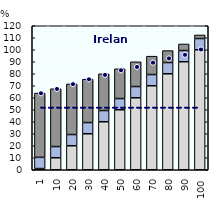
| Category | Gross earnings | Social assistance | Housing benefits | Family benefits | In-work benefits |
|---|---|---|---|---|---|
| 1.0 | 1.001 | 0 | 0 | 9.344 | 53.568 |
| 10.0 | 9.999 | 0 | 0 | 9.344 | 48.169 |
| 20.0 | 20.001 | 0 | 0 | 9.344 | 42.17 |
| 30.0 | 29.999 | 0 | 0 | 9.344 | 36.168 |
| 40.0 | 40.001 | 0 | 0 | 9.344 | 30.594 |
| 50.0 | 50 | 0 | 0 | 9.344 | 24.802 |
| 60.0 | 59.999 | 0 | 0 | 9.344 | 20.649 |
| 70.0 | 70.001 | 0 | 0 | 9.344 | 15.308 |
| 80.0 | 79.999 | 0 | 0 | 9.344 | 9.97 |
| 90.0 | 90.001 | 0 | 0 | 9.344 | 5.462 |
| 100.0 | 100 | 0 | 0 | 9.344 | 2.999 |